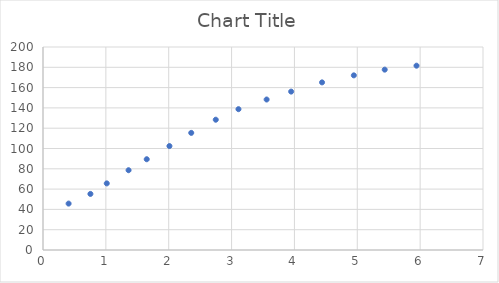
| Category | Series 0 |
|---|---|
| 0.754335260115607 | 55.24 |
| 1.01445086705202 | 65.625 |
| 0.407514450867052 | 45.721 |
| 1.36127167630057 | 78.606 |
| 1.65028901734104 | 89.423 |
| 2.01156069364161 | 102.404 |
| 2.35838150289017 | 115.385 |
| 2.74855491329479 | 128.365 |
| 3.10982658959537 | 138.75 |
| 3.55780346820809 | 148.269 |
| 3.94797687861271 | 156.058 |
| 4.4393063583815 | 165.144 |
| 4.94508670520231 | 172.067 |
| 5.43641618497109 | 177.692 |
| 5.9421965317919 | 181.587 |